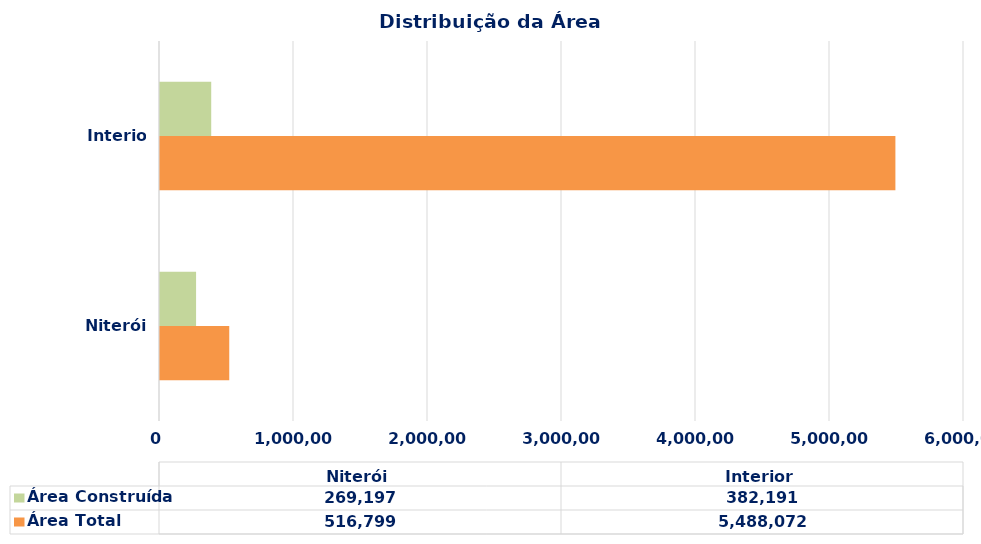
| Category | Área Total | Área Construída |
|---|---|---|
| Niterói | 516799 | 269197 |
| Interior | 5488072 | 382191 |